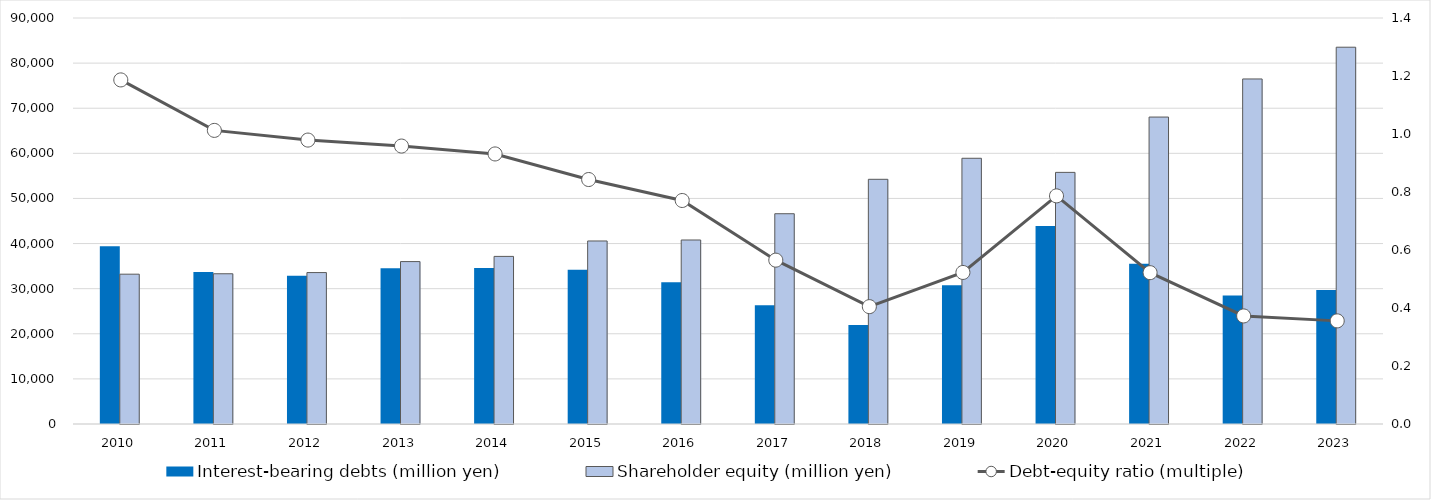
| Category | Interest-bearing debts (million yen) | Shareholder equity (million yen) |
|---|---|---|
| 2010 | 39407 | 33213 |
| 2011 | 33720 | 33306 |
| 2012 | 32865 | 33569 |
| 2013 | 34506 | 36002 |
| 2014 | 34599 | 37154 |
| 2015 | 34204 | 40573 |
| 2016 | 31438 | 40789 |
| 2017 | 26338 | 46614 |
| 2018 | 21952 | 54244 |
| 2019 | 30784 | 58904 |
| 2020 | 43876 | 55778 |
| 2021 | 35508 | 68043 |
| 2022 | 28500 | 76487 |
| 2023 | 29700 | 83523.251 |